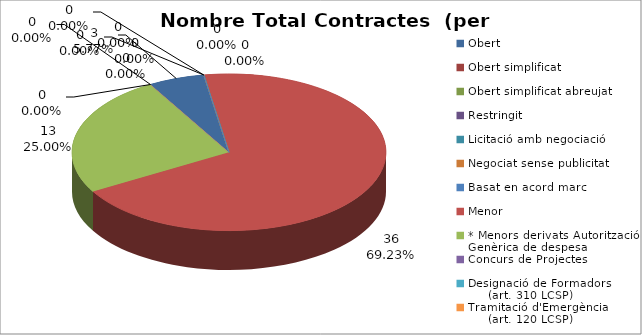
| Category | Nombre Total Contractes |
|---|---|
| Obert | 3 |
| Obert simplificat | 0 |
| Obert simplificat abreujat | 0 |
| Restringit | 0 |
| Licitació amb negociació | 0 |
| Negociat sense publicitat | 0 |
| Basat en acord marc | 0 |
| Menor | 36 |
| * Menors derivats Autorització Genèrica de despesa | 13 |
| Concurs de Projectes | 0 |
| Designació de Formadors
     (art. 310 LCSP) | 0 |
| Tramitació d'Emergència
     (art. 120 LCSP) | 0 |